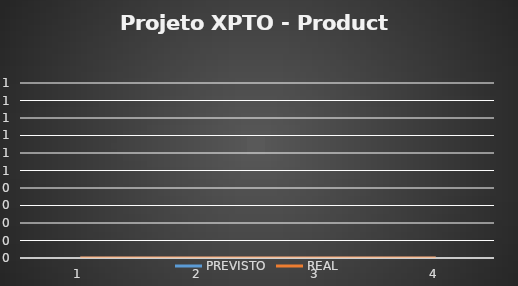
| Category | PREVISTO | REAL |
|---|---|---|
| 0 | 0 | 0 |
| 1 | 0 | 0 |
| 2 | 0 | 0 |
| 3 | 0 | 0 |